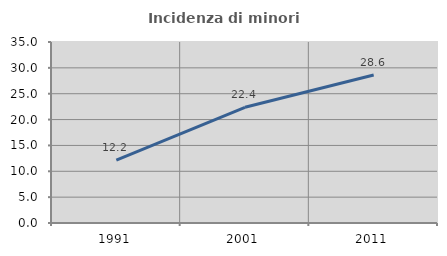
| Category | Incidenza di minori stranieri |
|---|---|
| 1991.0 | 12.162 |
| 2001.0 | 22.373 |
| 2011.0 | 28.622 |